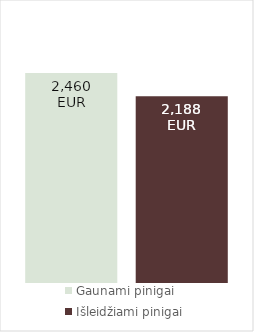
| Category | Gaunami pinigai | Išleidžiami pinigai |
|---|---|---|
| 0 | 2460 | 2188.333 |